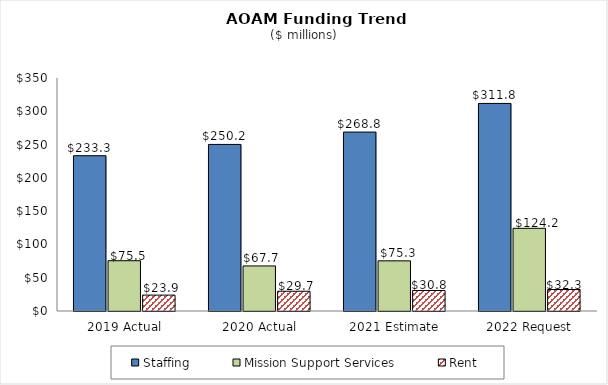
| Category |  Staffing  |  Mission Support Services  |  Rent  |
|---|---|---|---|
|  2019 Actual  | 233.29 | 75.533 | 23.87 |
|  2020 Actual  | 250.214 | 67.682 | 29.687 |
|  2021 Estimate  | 268.79 | 75.328 | 30.81 |
|  2022 Request  | 311.808 | 124.22 | 32.272 |